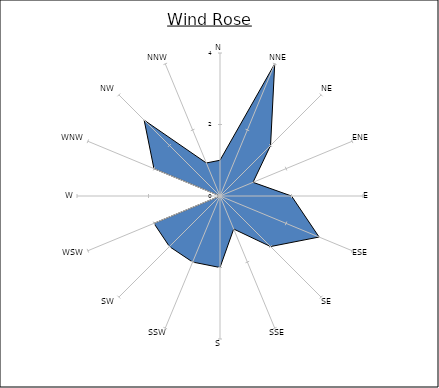
| Category | Series 0 |
|---|---|
| N | 1 |
| NNE | 4 |
| NE | 2 |
| ENE | 1 |
| E | 2 |
| ESE | 3 |
| SE | 2 |
| SSE | 1 |
| S | 2 |
| SSW | 2 |
| SW | 2 |
| WSW | 2 |
| W | 0 |
| WNW | 2 |
| NW | 3 |
| NNW | 1 |